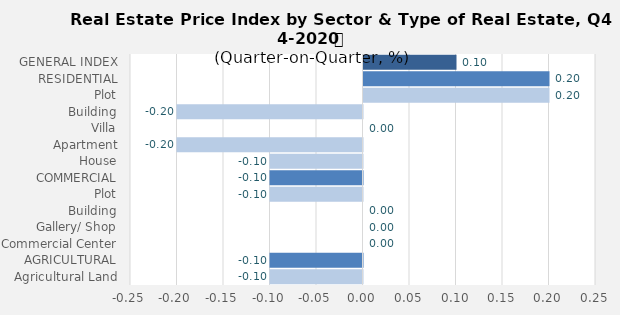
| Category | Q3-2020 |
|---|---|
| GENERAL INDEX | 0.1 |
| RESIDENTIAL | 0.2 |
| Plot | 0.2 |
| Building | -0.2 |
| Villa | 0 |
| Apartment | -0.2 |
| House | -0.1 |
| COMMERCIAL | -0.1 |
| Plot | -0.1 |
| Building | 0 |
| Gallery/ Shop | 0 |
| Commercial Center | 0 |
| AGRICULTURAL | -0.1 |
| Agricultural Land | -0.1 |